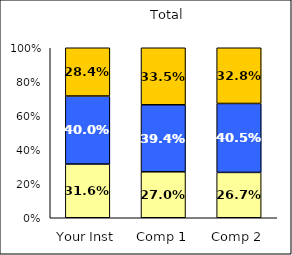
| Category | Low Civic Minded Values | Average Civic Minded Values | High Civic Minded Values |
|---|---|---|---|
| Your Inst | 0.316 | 0.4 | 0.284 |
| Comp 1 | 0.27 | 0.394 | 0.335 |
| Comp 2 | 0.267 | 0.405 | 0.328 |